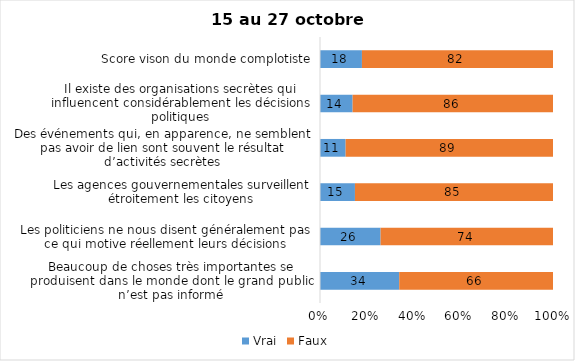
| Category | Vrai | Faux |
|---|---|---|
| Beaucoup de choses très importantes se produisent dans le monde dont le grand public n’est pas informé | 34 | 66 |
| Les politiciens ne nous disent généralement pas ce qui motive réellement leurs décisions | 26 | 74 |
| Les agences gouvernementales surveillent étroitement les citoyens | 15 | 85 |
| Des événements qui, en apparence, ne semblent pas avoir de lien sont souvent le résultat d’activités secrètes | 11 | 89 |
| Il existe des organisations secrètes qui influencent considérablement les décisions politiques | 14 | 86 |
| Score vison du monde complotiste | 18 | 82 |